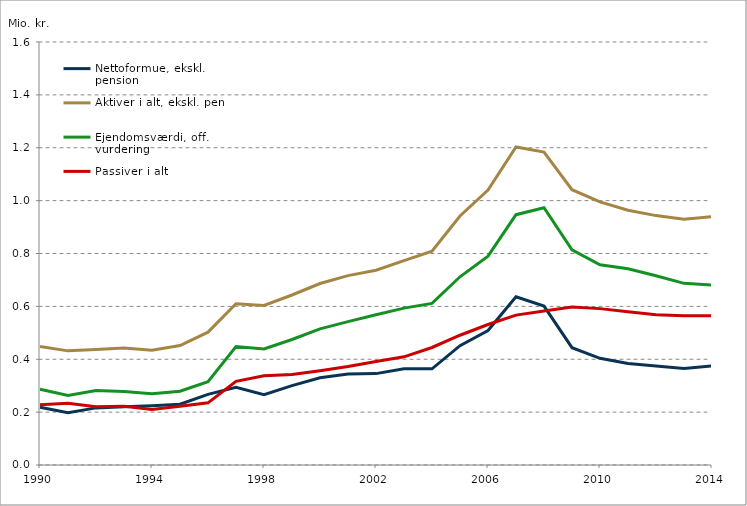
| Category | Nettoformue, ekskl. pension | Aktiver i alt, ekskl. pension | Ejendomsværdi, off. vurdering | Passiver i alt |
|---|---|---|---|---|
| 1990.0 | 0.219 | 0.448 | 0.287 | 0.228 |
| 1991.0 | 0.198 | 0.432 | 0.263 | 0.234 |
| 1992.0 | 0.216 | 0.437 | 0.282 | 0.221 |
| 1993.0 | 0.221 | 0.443 | 0.278 | 0.222 |
| 1994.0 | 0.224 | 0.434 | 0.27 | 0.21 |
| 1995.0 | 0.23 | 0.452 | 0.279 | 0.222 |
| 1996.0 | 0.267 | 0.503 | 0.315 | 0.235 |
| 1997.0 | 0.294 | 0.61 | 0.448 | 0.316 |
| 1998.0 | 0.266 | 0.603 | 0.439 | 0.337 |
| 1999.0 | 0.3 | 0.643 | 0.475 | 0.343 |
| 2000.0 | 0.33 | 0.687 | 0.515 | 0.357 |
| 2001.0 | 0.344 | 0.716 | 0.542 | 0.373 |
| 2002.0 | 0.346 | 0.737 | 0.569 | 0.391 |
| 2003.0 | 0.364 | 0.773 | 0.593 | 0.409 |
| 2004.0 | 0.364 | 0.808 | 0.611 | 0.444 |
| 2005.0 | 0.451 | 0.942 | 0.712 | 0.491 |
| 2006.0 | 0.509 | 1.04 | 0.79 | 0.531 |
| 2007.0 | 0.636 | 1.203 | 0.947 | 0.567 |
| 2008.0 | 0.601 | 1.184 | 0.973 | 0.583 |
| 2009.0 | 0.444 | 1.041 | 0.814 | 0.598 |
| 2010.0 | 0.404 | 0.995 | 0.758 | 0.592 |
| 2011.0 | 0.384 | 0.964 | 0.742 | 0.58 |
| 2012.0 | 0.375 | 0.943 | 0.716 | 0.569 |
| 2013.0 | 0.365 | 0.929 | 0.687 | 0.565 |
| 2014.0 | 0.375 | 0.939 | 0.681 | 0.564 |